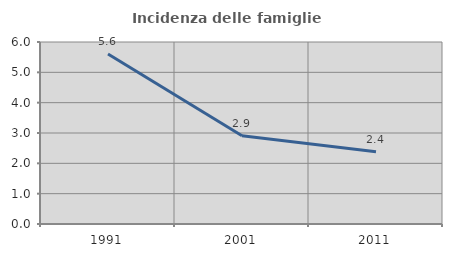
| Category | Incidenza delle famiglie numerose |
|---|---|
| 1991.0 | 5.602 |
| 2001.0 | 2.91 |
| 2011.0 | 2.383 |